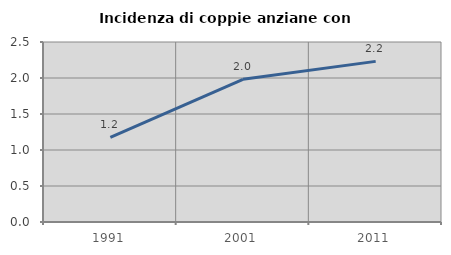
| Category | Incidenza di coppie anziane con figli |
|---|---|
| 1991.0 | 1.176 |
| 2001.0 | 1.981 |
| 2011.0 | 2.231 |